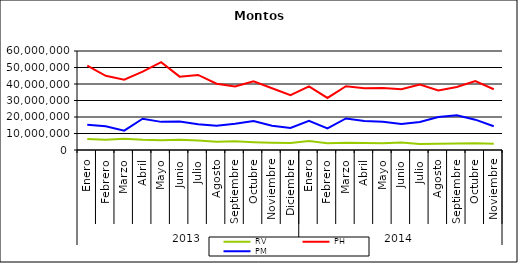
| Category | RV | PH | PM |
|---|---|---|---|
| 0 | 6603412.357 | 51097257.501 | 15291994.497 |
| 1 | 6144371.716 | 44938482.89 | 14418861.164 |
| 2 | 6870539.137 | 42574717.992 | 11735480.075 |
| 3 | 6139858.354 | 47535968.024 | 18924825.739 |
| 4 | 5890476.617 | 53273527.932 | 17047621.863 |
| 5 | 6142686.449 | 44450017.2 | 17254269.094 |
| 6 | 5792277.798 | 45481930.674 | 15546714.502 |
| 7 | 4962192.427 | 40196203.529 | 14644148.591 |
| 8 | 5244267.415 | 38549056.812 | 15946518.356 |
| 9 | 4723321.466 | 41614732.22 | 17536811.707 |
| 10 | 4437368.656 | 37439358.84 | 14761398.421 |
| 11 | 4226608.984 | 33178083.97 | 13384599.022 |
| 12 | 5420667.417 | 38592535.269 | 17738595.757 |
| 13 | 4106438.771 | 31549668.118 | 13082413.394 |
| 14 | 4333641.03 | 38643419.598 | 19107804.717 |
| 15 | 4275572.01 | 37358737.373 | 17555594.298 |
| 16 | 4139390.073 | 37637742.383 | 17146834.395 |
| 17 | 4553837.188 | 36763239.571 | 15771052.834 |
| 18 | 3703149.165 | 39606057.082 | 16994946.064 |
| 19 | 3782918.817 | 36051238.49 | 19934925.294 |
| 20 | 3865511.016 | 38158385.619 | 21028953.635 |
| 21 | 4039426.107 | 41798244.765 | 18387198.681 |
| 22 | 3787909.354 | 36802189.987 | 14381727.201 |